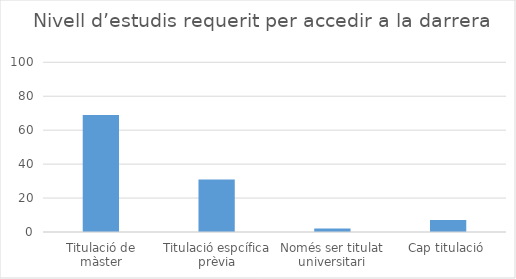
| Category | Series 0 |
|---|---|
| Titulació de màster | 69 |
| Titulació espcífica prèvia | 31 |
| Només ser titulat universitari | 2 |
| Cap titulació | 7 |